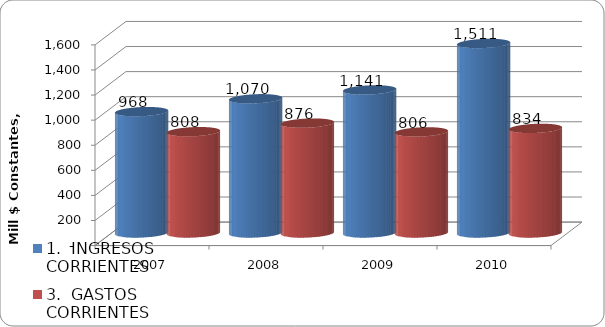
| Category | 1.  INGRESOS CORRIENTES | 3.  GASTOS CORRIENTES |
|---|---|---|
| 2007 | 967.861 | 808.152 |
| 2008 | 1070.413 | 876.479 |
| 2009 | 1141.014 | 806.469 |
| 2010 | 1511.451 | 834.295 |